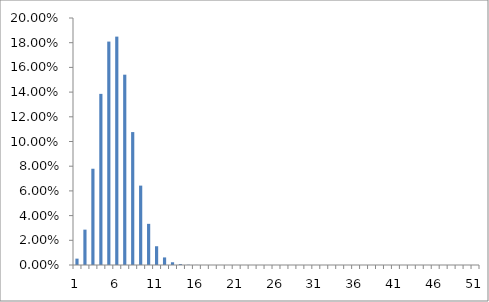
| Category | Series 0 |
|---|---|
| 0 | 0.005 |
| 1 | 0.029 |
| 2 | 0.078 |
| 3 | 0.139 |
| 4 | 0.181 |
| 5 | 0.185 |
| 6 | 0.154 |
| 7 | 0.108 |
| 8 | 0.064 |
| 9 | 0.033 |
| 10 | 0.015 |
| 11 | 0.006 |
| 12 | 0.002 |
| 13 | 0.001 |
| 14 | 0 |
| 15 | 0 |
| 16 | 0 |
| 17 | 0 |
| 18 | 0 |
| 19 | 0 |
| 20 | 0 |
| 21 | 0 |
| 22 | 0 |
| 23 | 0 |
| 24 | 0 |
| 25 | 0 |
| 26 | 0 |
| 27 | 0 |
| 28 | 0 |
| 29 | 0 |
| 30 | 0 |
| 31 | 0 |
| 32 | 0 |
| 33 | 0 |
| 34 | 0 |
| 35 | 0 |
| 36 | 0 |
| 37 | 0 |
| 38 | 0 |
| 39 | 0 |
| 40 | 0 |
| 41 | 0 |
| 42 | 0 |
| 43 | 0 |
| 44 | 0 |
| 45 | 0 |
| 46 | 0 |
| 47 | 0 |
| 48 | 0 |
| 49 | 0 |
| 50 | 0 |